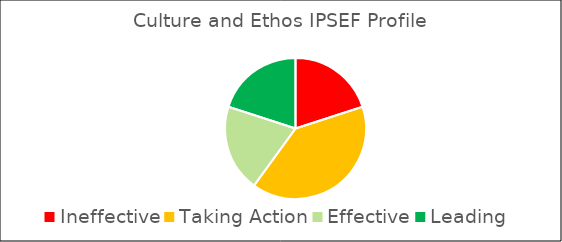
| Category | Count | % |
|---|---|---|
| Ineffective | 2 | 0.2 |
| Taking Action | 4 | 0.4 |
| Effective | 2 | 0.2 |
| Leading | 2 | 0.2 |